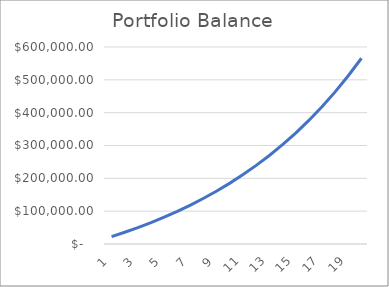
| Category | New_Balance |
|---|---|
| 1.0 | 22425 |
| 2.0 | 35700.471 |
| 3.0 | 49959.545 |
| 4.0 | 65286.422 |
| 5.0 | 81773.021 |
| 6.0 | 99519.73 |
| 7.0 | 118636.238 |
| 8.0 | 139242.455 |
| 9.0 | 161469.527 |
| 10.0 | 185460.951 |
| 11.0 | 211373.823 |
| 12.0 | 239380.2 |
| 13.0 | 269668.627 |
| 14.0 | 302445.811 |
| 15.0 | 337938.486 |
| 16.0 | 376395.479 |
| 17.0 | 418089.999 |
| 18.0 | 463322.18 |
| 19.0 | 512421.904 |
| 20.0 | 565751.937 |